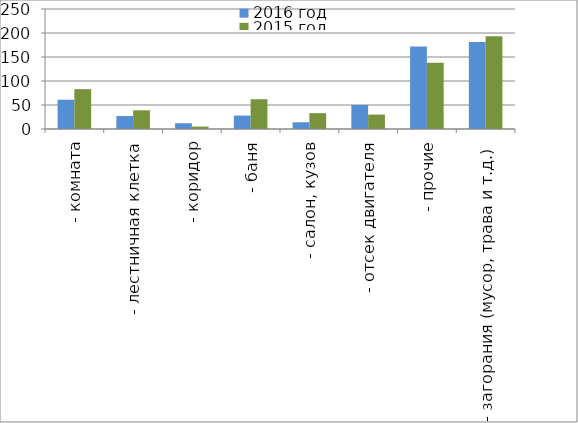
| Category | 2016 год | 2015 год |
|---|---|---|
|  - комната | 61 | 83 |
|  - лестничная клетка | 27 | 39 |
|  - коридор | 12 | 5 |
|  - баня | 28 | 62 |
|  - салон, кузов | 14 | 33 |
|  - отсек двигателя | 50 | 30 |
| - прочие | 172 | 138 |
| - загорания (мусор, трава и т.д.)  | 181 | 193 |